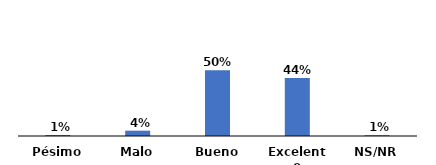
| Category | Series 0 |
|---|---|
| Pésimo | 0.008 |
| Malo | 0.041 |
| Bueno | 0.502 |
| Excelente | 0.444 |
| NS/NR | 0.006 |